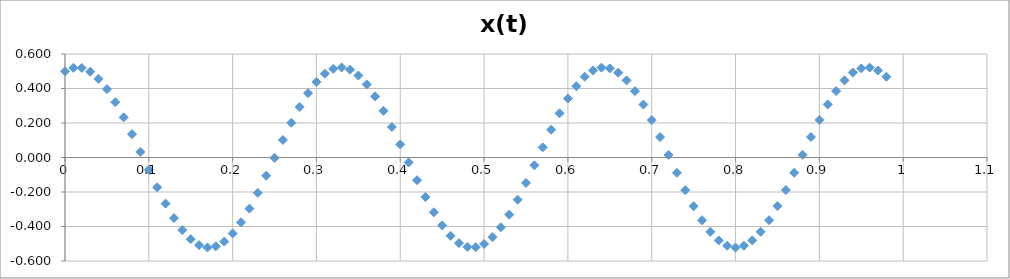
| Category | Series 0 |
|---|---|
| 0.0 | 0.5 |
| 0.01 | 0.52 |
| 0.02 | 0.519 |
| 0.03 | 0.497 |
| 0.04 | 0.456 |
| 0.05 | 0.396 |
| 0.06 | 0.321 |
| 0.07 | 0.233 |
| 0.08 | 0.135 |
| 0.09 | 0.032 |
| 0.1 | -0.072 |
| 0.11 | -0.173 |
| 0.12 | -0.267 |
| 0.13 | -0.351 |
| 0.14 | -0.421 |
| 0.15 | -0.474 |
| 0.16 | -0.508 |
| 0.17 | -0.522 |
| 0.18 | -0.515 |
| 0.19 | -0.487 |
| 0.2 | -0.44 |
| 0.21 | -0.376 |
| 0.22 | -0.296 |
| 0.23 | -0.205 |
| 0.24 | -0.106 |
| 0.25 | -0.002 |
| 0.26 | 0.102 |
| 0.27 | 0.201 |
| 0.28 | 0.293 |
| 0.29 | 0.373 |
| 0.3 | 0.438 |
| 0.31 | 0.486 |
| 0.32 | 0.514 |
| 0.33 | 0.522 |
| 0.34 | 0.509 |
| 0.35 | 0.475 |
| 0.36 | 0.423 |
| 0.37 | 0.354 |
| 0.38 | 0.271 |
| 0.39 | 0.177 |
| 0.4 | 0.076 |
| 0.41 | -0.028 |
| 0.42 | -0.131 |
| 0.43 | -0.229 |
| 0.44 | -0.318 |
| 0.45 | -0.394 |
| 0.46 | -0.454 |
| 0.47 | -0.496 |
| 0.48 | -0.518 |
| 0.49 | -0.52 |
| 0.5 | -0.501 |
| 0.51 | -0.462 |
| 0.52 | -0.405 |
| 0.53 | -0.331 |
| 0.54 | -0.244 |
| 0.55 | -0.148 |
| 0.56 | -0.045 |
| 0.57 | 0.059 |
| 0.58 | 0.161 |
| 0.59 | 0.256 |
| 0.6 | 0.341 |
| 0.61 | 0.413 |
| 0.62 | 0.468 |
| 0.63 | 0.505 |
| 0.64 | 0.521 |
| 0.65 | 0.517 |
| 0.66 | 0.492 |
| 0.67 | 0.447 |
| 0.68 | 0.385 |
| 0.69 | 0.307 |
| 0.7 | 0.217 |
| 0.71 | 0.118 |
| 0.72 | 0.015 |
| 0.73 | -0.089 |
| 0.74 | -0.189 |
| 0.75 | -0.282 |
| 0.76 | -0.364 |
| 0.77 | -0.431 |
| 0.78 | -0.481 |
| 0.79 | -0.512 |
| 0.8 | -0.522 |
| 0.81 | -0.512 |
| 0.82 | -0.481 |
| 0.83 | -0.431 |
| 0.84 | -0.363 |
| 0.85 | -0.282 |
| 0.86 | -0.189 |
| 0.87 | -0.088 |
| 0.88 | 0.016 |
| 0.89 | 0.119 |
| 0.9 | 0.218 |
| 0.91 | 0.307 |
| 0.92 | 0.385 |
| 0.93 | 0.447 |
| 0.94 | 0.492 |
| 0.95 | 0.517 |
| 0.96 | 0.521 |
| 0.97 | 0.505 |
| 0.98 | 0.468 |